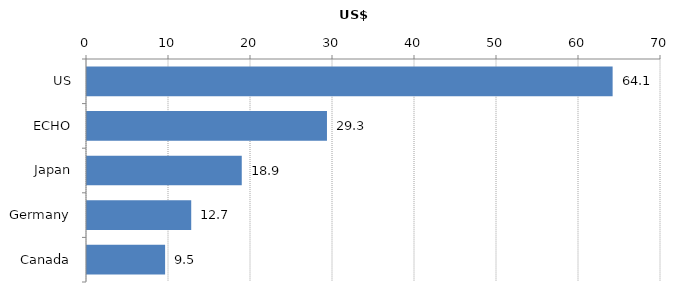
| Category | Series 0 |
|---|---|
| US | 64.101 |
| ECHO | 29.265 |
| Japan | 18.873 |
| Germany | 12.71 |
| Canada | 9.525 |